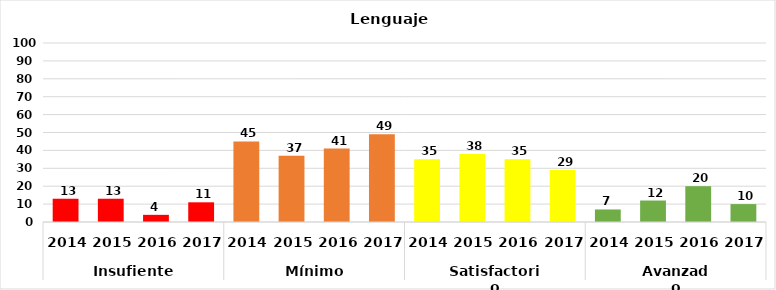
| Category | Series 0 |
|---|---|
| 0 | 13 |
| 1 | 13 |
| 2 | 4 |
| 3 | 11 |
| 4 | 45 |
| 5 | 37 |
| 6 | 41 |
| 7 | 49 |
| 8 | 35 |
| 9 | 38 |
| 10 | 35 |
| 11 | 29 |
| 12 | 7 |
| 13 | 12 |
| 14 | 20 |
| 15 | 10 |